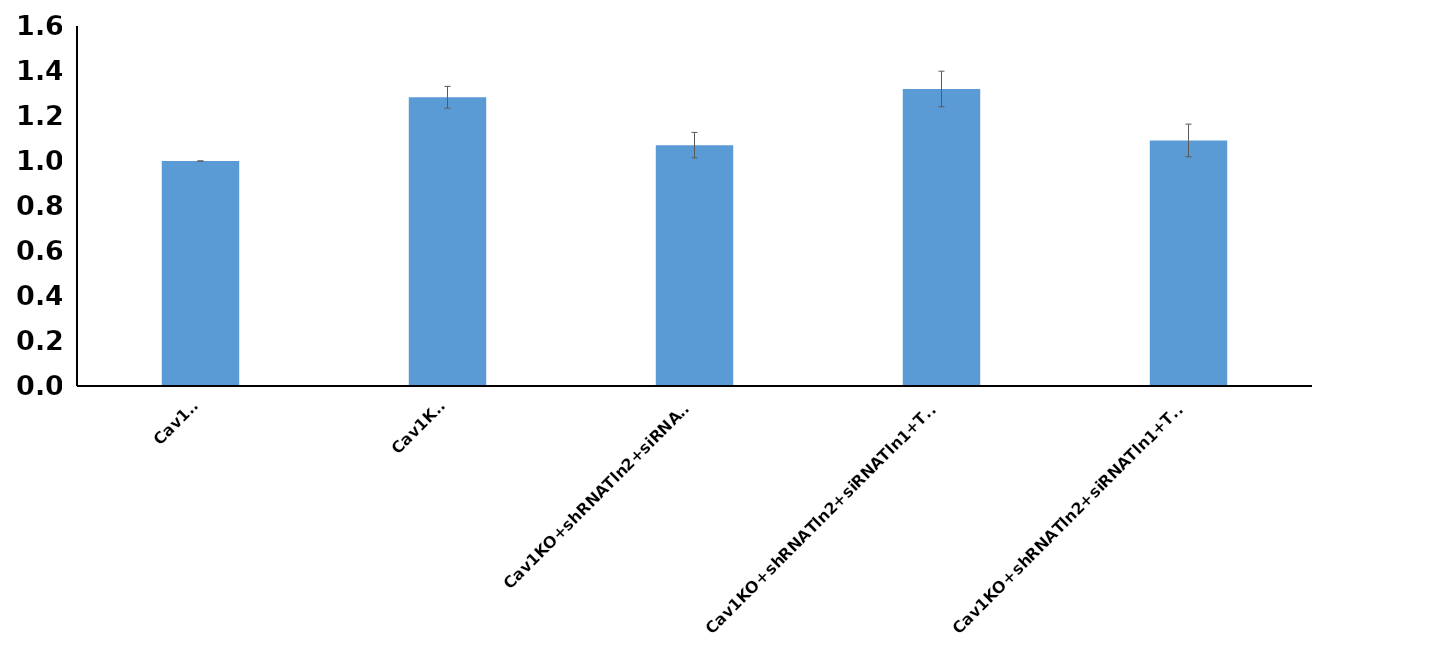
| Category | Series 0 |
|---|---|
| Cav1WT | 1 |
| Cav1KO | 1.283 |
| Cav1KO+shRNATln2+siRNATln1 | 1.071 |
| Cav1KO+shRNATln2+siRNATln1+TH WT | 1.32 |
| Cav1KO+shRNATln2+siRNATln1+TH Mut | 1.091 |